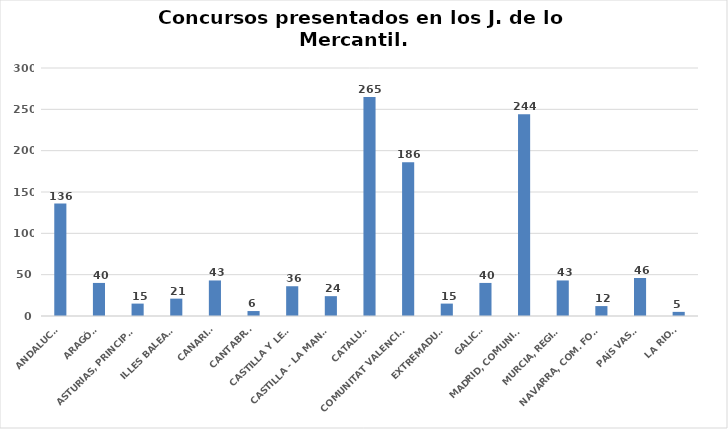
| Category | Series 0 |
|---|---|
| ANDALUCÍA | 136 |
| ARAGÓN | 40 |
| ASTURIAS, PRINCIPADO | 15 |
| ILLES BALEARS | 21 |
| CANARIAS | 43 |
| CANTABRIA | 6 |
| CASTILLA Y LEÓN | 36 |
| CASTILLA - LA MANCHA | 24 |
| CATALUÑA | 265 |
| COMUNITAT VALENCIANA | 186 |
| EXTREMADURA | 15 |
| GALICIA | 40 |
| MADRID, COMUNIDAD | 244 |
| MURCIA, REGIÓN | 43 |
| NAVARRA, COM. FORAL | 12 |
| PAÍS VASCO | 46 |
| LA RIOJA | 5 |